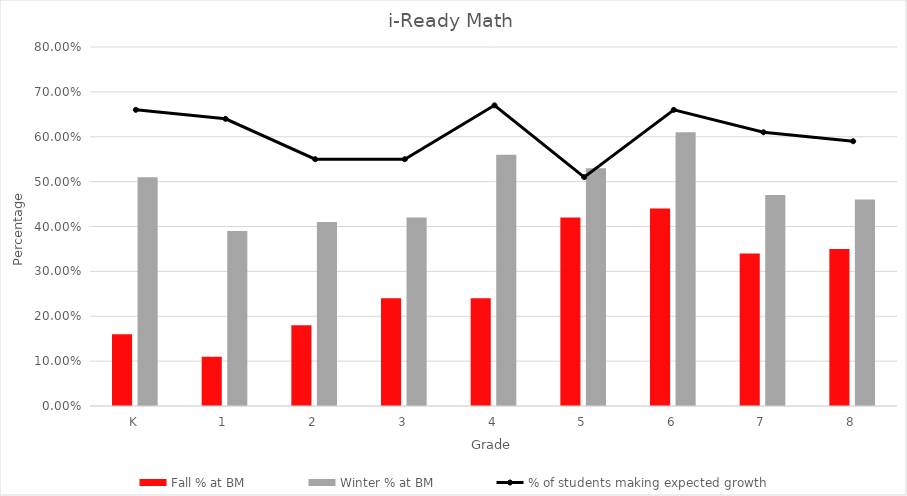
| Category | Fall % at BM | Winter % at BM |
|---|---|---|
| K | 0.16 | 0.51 |
| 1 | 0.11 | 0.39 |
| 2 | 0.18 | 0.41 |
| 3 | 0.24 | 0.42 |
| 4 | 0.24 | 0.56 |
| 5 | 0.42 | 0.53 |
| 6 | 0.44 | 0.61 |
| 7 | 0.34 | 0.47 |
| 8 | 0.35 | 0.46 |